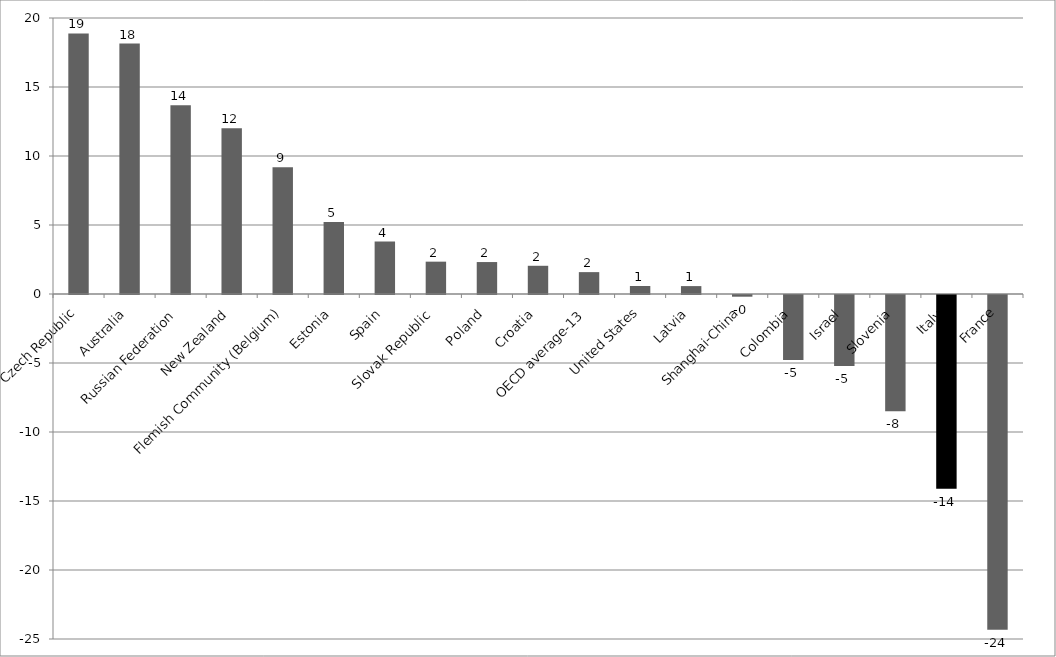
| Category | Series 0 |
|---|---|
| Czech Republic | 18.885 |
| Australia | 18.145 |
| Russian Federation | 13.671 |
| New Zealand | 12.003 |
| Flemish Community (Belgium) | 9.189 |
| Estonia | 5.225 |
| Spain | 3.798 |
| Slovak Republic | 2.344 |
| Poland | 2.315 |
| Croatia | 2.045 |
| OECD average-13 | 1.585 |
| United States | 0.579 |
| Latvia | 0.573 |
| Shanghai-China | -0.123 |
| Colombia | -4.719 |
| Israel | -5.15 |
| Slovenia | -8.42 |
| Italy | -14.048 |
| France | -24.262 |